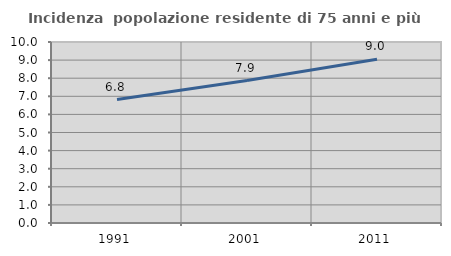
| Category | Incidenza  popolazione residente di 75 anni e più |
|---|---|
| 1991.0 | 6.82 |
| 2001.0 | 7.869 |
| 2011.0 | 9.043 |